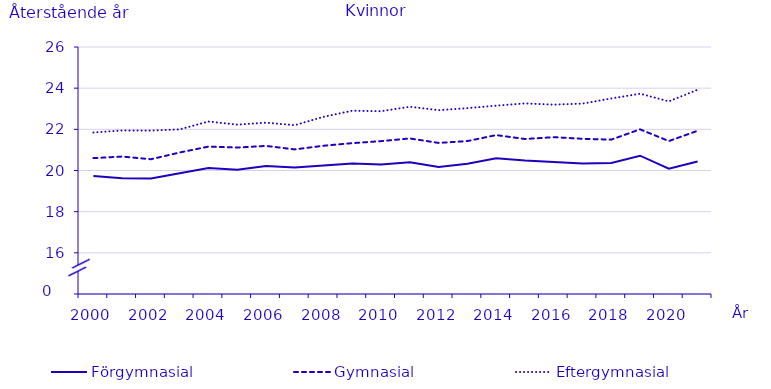
| Category | Förgymnasial | Gymnasial | Eftergymnasial |
|---|---|---|---|
| 2000.0 | 19.737 | 20.601 | 21.846 |
| 2001.0 | 19.624 | 20.677 | 21.944 |
| 2002.0 | 19.609 | 20.548 | 21.939 |
| 2003.0 | 19.865 | 20.875 | 21.999 |
| 2004.0 | 20.123 | 21.162 | 22.379 |
| 2005.0 | 20.042 | 21.115 | 22.229 |
| 2006.0 | 20.22 | 21.194 | 22.322 |
| 2007.0 | 20.147 | 21.025 | 22.203 |
| 2008.0 | 20.24 | 21.203 | 22.608 |
| 2009.0 | 20.336 | 21.329 | 22.906 |
| 2010.0 | 20.295 | 21.427 | 22.88 |
| 2011.0 | 20.401 | 21.557 | 23.097 |
| 2012.0 | 20.17 | 21.34 | 22.93 |
| 2013.0 | 20.33 | 21.43 | 23.03 |
| 2014.0 | 20.59 | 21.72 | 23.15 |
| 2015.0 | 20.48 | 21.53 | 23.26 |
| 2016.0 | 20.41 | 21.62 | 23.2 |
| 2017.0 | 20.34 | 21.54 | 23.25 |
| 2018.0 | 20.37 | 21.5 | 23.5 |
| 2019.0 | 20.72 | 22 | 23.73 |
| 2020.0 | 20.09 | 21.43 | 23.36 |
| 2021.0 | 20.44 | 21.93 | 23.92 |